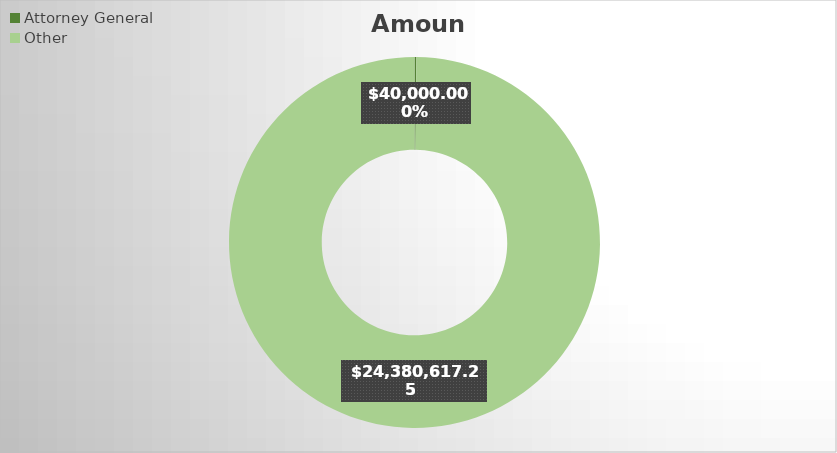
| Category | Amount |
|---|---|
| Attorney General | 40000 |
| Other | 24380617.25 |